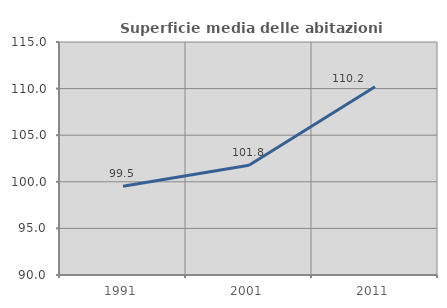
| Category | Superficie media delle abitazioni occupate |
|---|---|
| 1991.0 | 99.516 |
| 2001.0 | 101.767 |
| 2011.0 | 110.204 |